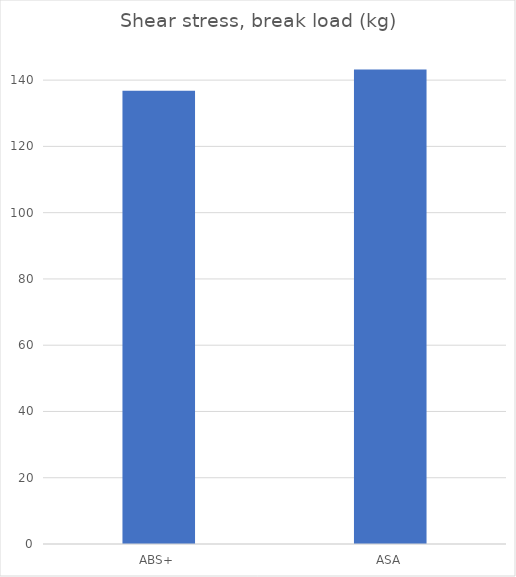
| Category | Break kg |
|---|---|
| ABS+ | 136.8 |
| ASA | 143.2 |